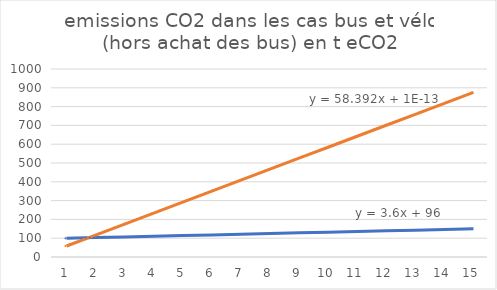
| Category | prod CO2 avec vélos | prod CO2 avec bus |
|---|---|---|
| 1.0 | 99.6 | 58.392 |
| 2.0 | 103.2 | 116.784 |
| 3.0 | 106.8 | 175.176 |
| 4.0 | 110.4 | 233.568 |
| 5.0 | 114 | 291.96 |
| 6.0 | 117.6 | 350.352 |
| 7.0 | 121.2 | 408.744 |
| 8.0 | 124.8 | 467.136 |
| 9.0 | 128.4 | 525.528 |
| 10.0 | 132 | 583.92 |
| 11.0 | 135.6 | 642.312 |
| 12.0 | 139.2 | 700.704 |
| 13.0 | 142.8 | 759.096 |
| 14.0 | 146.4 | 817.488 |
| 15.0 | 150 | 875.88 |